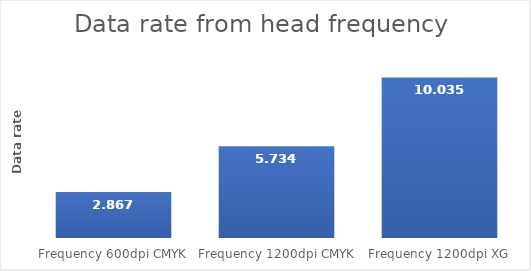
| Category | Series 0 |
|---|---|
| Frequency 600dpi CMYK | 2.867 |
| Frequency 1200dpi CMYK | 5.734 |
| Frequency 1200dpi XG | 10.035 |